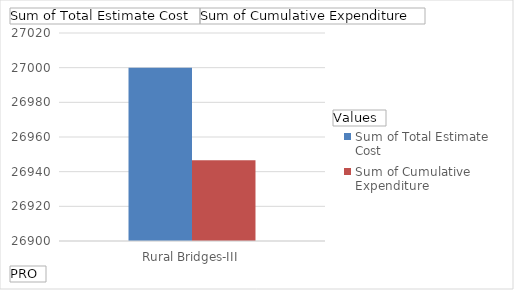
| Category | Sum of Total Estimate Cost | Sum of Cumulative Expenditure  |
|---|---|---|
| Rural Bridges-III | 27000 | 26946.58 |